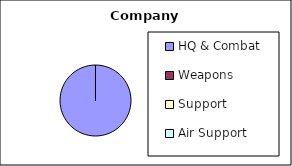
| Category | Series 0 |
|---|---|
| HQ & Combat  | 135 |
| Weapons  | 0 |
| Support  | 0 |
| Air Support | 0 |